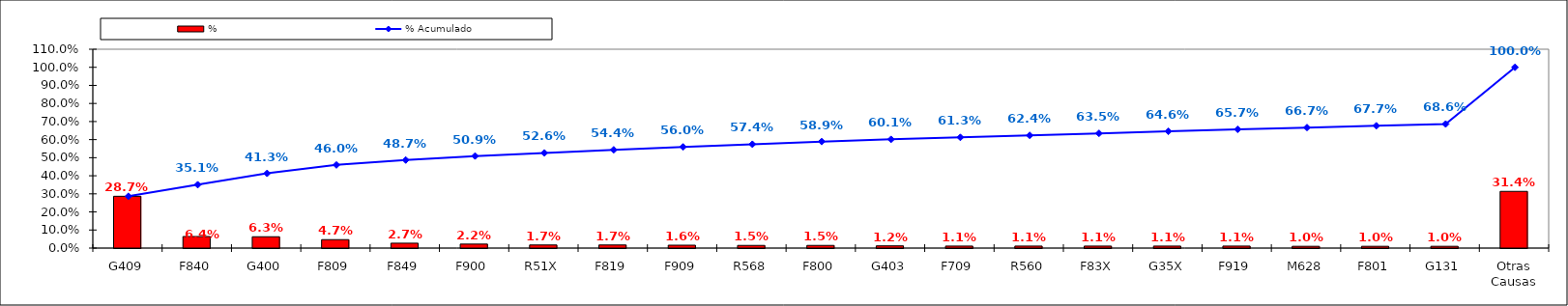
| Category | % |
|---|---|
| G409 | 0.287 |
| F840 | 0.064 |
| G400 | 0.063 |
| F809 | 0.047 |
| F849 | 0.027 |
| F900 | 0.022 |
| R51X | 0.017 |
| F819 | 0.017 |
| F909 | 0.016 |
| R568 | 0.015 |
| F800 | 0.015 |
| G403 | 0.012 |
| F709 | 0.011 |
| R560 | 0.011 |
| F83X | 0.011 |
| G35X | 0.011 |
| F919 | 0.011 |
| M628 | 0.01 |
| F801 | 0.01 |
| G131 | 0.01 |
| Otras Causas | 0.314 |